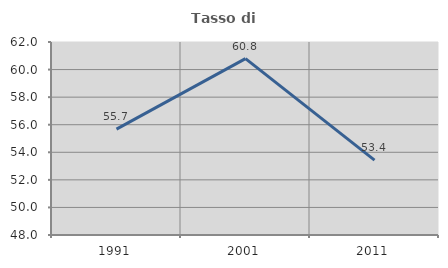
| Category | Tasso di occupazione   |
|---|---|
| 1991.0 | 55.68 |
| 2001.0 | 60.793 |
| 2011.0 | 53.43 |